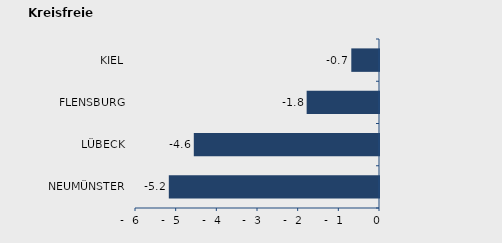
| Category | Überschuss der Geborenen (+) bzw. Gestorbenen (-) |
|---|---|
| NEUMÜNSTER | -5.169 |
| LÜBECK | -4.554 |
| FLENSBURG | -1.779 |
| KIEL | -0.681 |